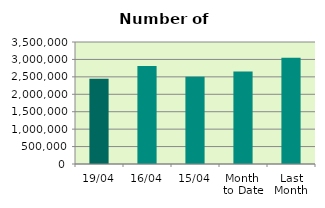
| Category | Series 0 |
|---|---|
| 19/04 | 2443552 |
| 16/04 | 2809124 |
| 15/04 | 2506604 |
| Month 
to Date | 2652954.727 |
| Last
Month | 3050763.217 |